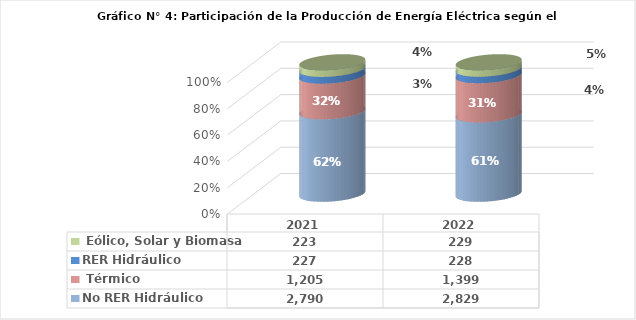
| Category | No RER | RER |
|---|---|---|
| 2021.0 | 1205.336 | 223.016 |
| 2022.0 | 1399.432 | 229.406 |